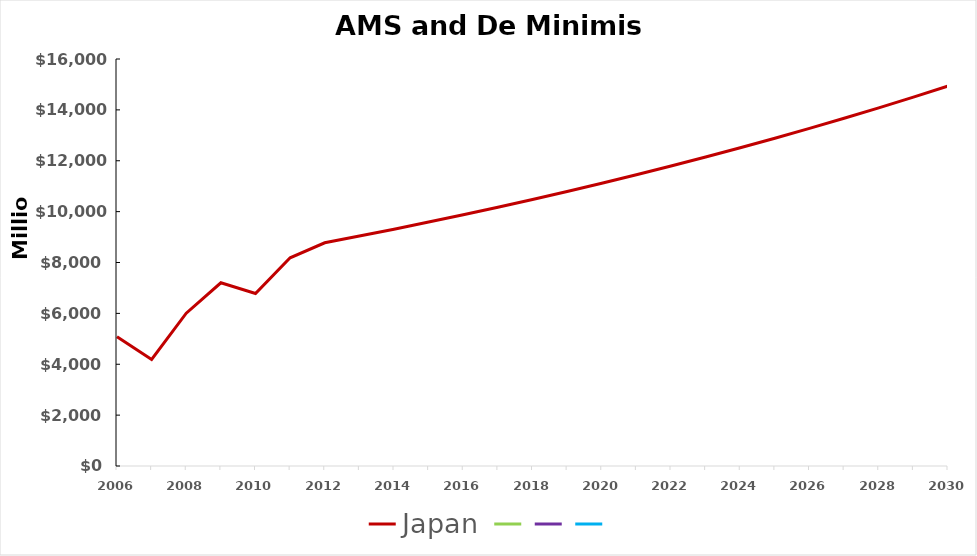
| Category | Japan | Series 3 | Series 4 | Series 0 |
|---|---|---|---|---|
| 2006.0 | 5083599507.82 |  |  |  |
| 2007.0 | 4186706648.589 |  |  |  |
| 2008.0 | 6007172628.256 |  |  |  |
| 2009.0 | 7201842226.881 |  |  |  |
| 2010.0 | 6780707633.873 |  |  |  |
| 2011.0 | 8186283867.864 |  |  |  |
| 2012.0 | 8774838721.985 |  |  |  |
| 2013.0 | 9038083883.644 |  |  |  |
| 2014.0 | 9309226400.153 |  |  |  |
| 2015.0 | 9588503192.158 |  |  |  |
| 2016.0 | 9876158287.923 |  |  |  |
| 2017.0 | 10172443036.56 |  |  |  |
| 2018.0 | 10477616327.657 |  |  |  |
| 2019.0 | 10791944817.487 |  |  |  |
| 2020.0 | 11115703162.012 |  |  |  |
| 2021.0 | 11449174256.872 |  |  |  |
| 2022.0 | 11792649484.578 |  |  |  |
| 2023.0 | 12146428969.115 |  |  |  |
| 2024.0 | 12510821838.189 |  |  |  |
| 2025.0 | 12886146493.335 |  |  |  |
| 2026.0 | 13272730888.135 |  |  |  |
| 2027.0 | 13670912814.779 |  |  |  |
| 2028.0 | 14081040199.222 |  |  |  |
| 2029.0 | 14503471405.199 |  |  |  |
| 2030.0 | 14938575547.355 |  |  |  |